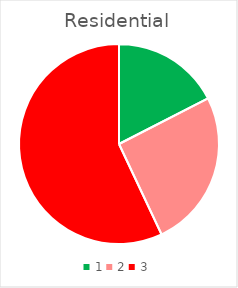
| Category | Series 0 |
|---|---|
| 0 | 0.592 |
| 1 | 0.866 |
| 2 | 1.932 |